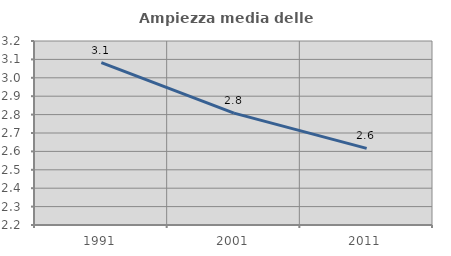
| Category | Ampiezza media delle famiglie |
|---|---|
| 1991.0 | 3.083 |
| 2001.0 | 2.808 |
| 2011.0 | 2.616 |